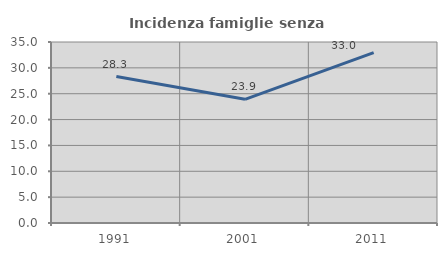
| Category | Incidenza famiglie senza nuclei |
|---|---|
| 1991.0 | 28.312 |
| 2001.0 | 23.922 |
| 2011.0 | 32.952 |